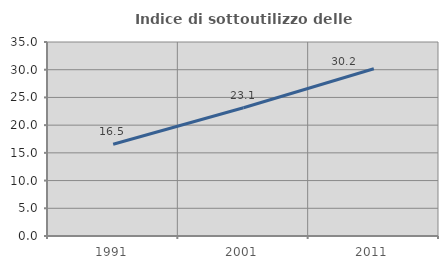
| Category | Indice di sottoutilizzo delle abitazioni  |
|---|---|
| 1991.0 | 16.544 |
| 2001.0 | 23.137 |
| 2011.0 | 30.178 |